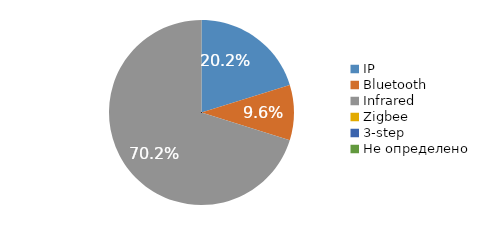
| Category | Series 0 |
|---|---|
| IP | 0.202 |
| Bluetooth | 0.096 |
| Infrared | 0.702 |
| Zigbee | 0 |
| 3-step | 0 |
| Не определено | 0 |